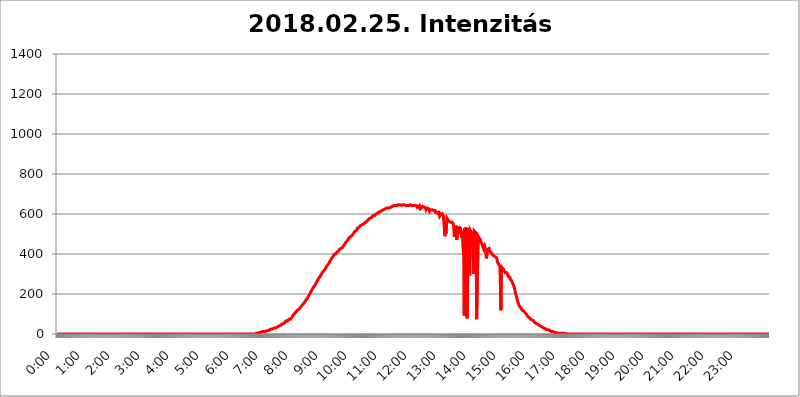
| Category | 2018.02.25. Intenzitás [W/m^2] |
|---|---|
| 0.0 | 0 |
| 0.0006944444444444445 | 0 |
| 0.001388888888888889 | 0 |
| 0.0020833333333333333 | 0 |
| 0.002777777777777778 | 0 |
| 0.003472222222222222 | 0 |
| 0.004166666666666667 | 0 |
| 0.004861111111111111 | 0 |
| 0.005555555555555556 | 0 |
| 0.0062499999999999995 | 0 |
| 0.006944444444444444 | 0 |
| 0.007638888888888889 | 0 |
| 0.008333333333333333 | 0 |
| 0.009027777777777779 | 0 |
| 0.009722222222222222 | 0 |
| 0.010416666666666666 | 0 |
| 0.011111111111111112 | 0 |
| 0.011805555555555555 | 0 |
| 0.012499999999999999 | 0 |
| 0.013194444444444444 | 0 |
| 0.013888888888888888 | 0 |
| 0.014583333333333332 | 0 |
| 0.015277777777777777 | 0 |
| 0.015972222222222224 | 0 |
| 0.016666666666666666 | 0 |
| 0.017361111111111112 | 0 |
| 0.018055555555555557 | 0 |
| 0.01875 | 0 |
| 0.019444444444444445 | 0 |
| 0.02013888888888889 | 0 |
| 0.020833333333333332 | 0 |
| 0.02152777777777778 | 0 |
| 0.022222222222222223 | 0 |
| 0.02291666666666667 | 0 |
| 0.02361111111111111 | 0 |
| 0.024305555555555556 | 0 |
| 0.024999999999999998 | 0 |
| 0.025694444444444447 | 0 |
| 0.02638888888888889 | 0 |
| 0.027083333333333334 | 0 |
| 0.027777777777777776 | 0 |
| 0.02847222222222222 | 0 |
| 0.029166666666666664 | 0 |
| 0.029861111111111113 | 0 |
| 0.030555555555555555 | 0 |
| 0.03125 | 0 |
| 0.03194444444444445 | 0 |
| 0.03263888888888889 | 0 |
| 0.03333333333333333 | 0 |
| 0.034027777777777775 | 0 |
| 0.034722222222222224 | 0 |
| 0.035416666666666666 | 0 |
| 0.036111111111111115 | 0 |
| 0.03680555555555556 | 0 |
| 0.0375 | 0 |
| 0.03819444444444444 | 0 |
| 0.03888888888888889 | 0 |
| 0.03958333333333333 | 0 |
| 0.04027777777777778 | 0 |
| 0.04097222222222222 | 0 |
| 0.041666666666666664 | 0 |
| 0.042361111111111106 | 0 |
| 0.04305555555555556 | 0 |
| 0.043750000000000004 | 0 |
| 0.044444444444444446 | 0 |
| 0.04513888888888889 | 0 |
| 0.04583333333333334 | 0 |
| 0.04652777777777778 | 0 |
| 0.04722222222222222 | 0 |
| 0.04791666666666666 | 0 |
| 0.04861111111111111 | 0 |
| 0.049305555555555554 | 0 |
| 0.049999999999999996 | 0 |
| 0.05069444444444445 | 0 |
| 0.051388888888888894 | 0 |
| 0.052083333333333336 | 0 |
| 0.05277777777777778 | 0 |
| 0.05347222222222222 | 0 |
| 0.05416666666666667 | 0 |
| 0.05486111111111111 | 0 |
| 0.05555555555555555 | 0 |
| 0.05625 | 0 |
| 0.05694444444444444 | 0 |
| 0.057638888888888885 | 0 |
| 0.05833333333333333 | 0 |
| 0.05902777777777778 | 0 |
| 0.059722222222222225 | 0 |
| 0.06041666666666667 | 0 |
| 0.061111111111111116 | 0 |
| 0.06180555555555556 | 0 |
| 0.0625 | 0 |
| 0.06319444444444444 | 0 |
| 0.06388888888888888 | 0 |
| 0.06458333333333334 | 0 |
| 0.06527777777777778 | 0 |
| 0.06597222222222222 | 0 |
| 0.06666666666666667 | 0 |
| 0.06736111111111111 | 0 |
| 0.06805555555555555 | 0 |
| 0.06874999999999999 | 0 |
| 0.06944444444444443 | 0 |
| 0.07013888888888889 | 0 |
| 0.07083333333333333 | 0 |
| 0.07152777777777779 | 0 |
| 0.07222222222222223 | 0 |
| 0.07291666666666667 | 0 |
| 0.07361111111111111 | 0 |
| 0.07430555555555556 | 0 |
| 0.075 | 0 |
| 0.07569444444444444 | 0 |
| 0.0763888888888889 | 0 |
| 0.07708333333333334 | 0 |
| 0.07777777777777778 | 0 |
| 0.07847222222222222 | 0 |
| 0.07916666666666666 | 0 |
| 0.0798611111111111 | 0 |
| 0.08055555555555556 | 0 |
| 0.08125 | 0 |
| 0.08194444444444444 | 0 |
| 0.08263888888888889 | 0 |
| 0.08333333333333333 | 0 |
| 0.08402777777777777 | 0 |
| 0.08472222222222221 | 0 |
| 0.08541666666666665 | 0 |
| 0.08611111111111112 | 0 |
| 0.08680555555555557 | 0 |
| 0.08750000000000001 | 0 |
| 0.08819444444444445 | 0 |
| 0.08888888888888889 | 0 |
| 0.08958333333333333 | 0 |
| 0.09027777777777778 | 0 |
| 0.09097222222222222 | 0 |
| 0.09166666666666667 | 0 |
| 0.09236111111111112 | 0 |
| 0.09305555555555556 | 0 |
| 0.09375 | 0 |
| 0.09444444444444444 | 0 |
| 0.09513888888888888 | 0 |
| 0.09583333333333333 | 0 |
| 0.09652777777777777 | 0 |
| 0.09722222222222222 | 0 |
| 0.09791666666666667 | 0 |
| 0.09861111111111111 | 0 |
| 0.09930555555555555 | 0 |
| 0.09999999999999999 | 0 |
| 0.10069444444444443 | 0 |
| 0.1013888888888889 | 0 |
| 0.10208333333333335 | 0 |
| 0.10277777777777779 | 0 |
| 0.10347222222222223 | 0 |
| 0.10416666666666667 | 0 |
| 0.10486111111111111 | 0 |
| 0.10555555555555556 | 0 |
| 0.10625 | 0 |
| 0.10694444444444444 | 0 |
| 0.1076388888888889 | 0 |
| 0.10833333333333334 | 0 |
| 0.10902777777777778 | 0 |
| 0.10972222222222222 | 0 |
| 0.1111111111111111 | 0 |
| 0.11180555555555556 | 0 |
| 0.11180555555555556 | 0 |
| 0.1125 | 0 |
| 0.11319444444444444 | 0 |
| 0.11388888888888889 | 0 |
| 0.11458333333333333 | 0 |
| 0.11527777777777777 | 0 |
| 0.11597222222222221 | 0 |
| 0.11666666666666665 | 0 |
| 0.1173611111111111 | 0 |
| 0.11805555555555557 | 0 |
| 0.11944444444444445 | 0 |
| 0.12013888888888889 | 0 |
| 0.12083333333333333 | 0 |
| 0.12152777777777778 | 0 |
| 0.12222222222222223 | 0 |
| 0.12291666666666667 | 0 |
| 0.12291666666666667 | 0 |
| 0.12361111111111112 | 0 |
| 0.12430555555555556 | 0 |
| 0.125 | 0 |
| 0.12569444444444444 | 0 |
| 0.12638888888888888 | 0 |
| 0.12708333333333333 | 0 |
| 0.16875 | 0 |
| 0.12847222222222224 | 0 |
| 0.12916666666666668 | 0 |
| 0.12986111111111112 | 0 |
| 0.13055555555555556 | 0 |
| 0.13125 | 0 |
| 0.13194444444444445 | 0 |
| 0.1326388888888889 | 0 |
| 0.13333333333333333 | 0 |
| 0.13402777777777777 | 0 |
| 0.13402777777777777 | 0 |
| 0.13472222222222222 | 0 |
| 0.13541666666666666 | 0 |
| 0.1361111111111111 | 0 |
| 0.13749999999999998 | 0 |
| 0.13819444444444443 | 0 |
| 0.1388888888888889 | 0 |
| 0.13958333333333334 | 0 |
| 0.14027777777777778 | 0 |
| 0.14097222222222222 | 0 |
| 0.14166666666666666 | 0 |
| 0.1423611111111111 | 0 |
| 0.14305555555555557 | 0 |
| 0.14375000000000002 | 0 |
| 0.14444444444444446 | 0 |
| 0.1451388888888889 | 0 |
| 0.1451388888888889 | 0 |
| 0.14652777777777778 | 0 |
| 0.14722222222222223 | 0 |
| 0.14791666666666667 | 0 |
| 0.1486111111111111 | 0 |
| 0.14930555555555555 | 0 |
| 0.15 | 0 |
| 0.15069444444444444 | 0 |
| 0.15138888888888888 | 0 |
| 0.15208333333333332 | 0 |
| 0.15277777777777776 | 0 |
| 0.15347222222222223 | 0 |
| 0.15416666666666667 | 0 |
| 0.15486111111111112 | 0 |
| 0.15555555555555556 | 0 |
| 0.15625 | 0 |
| 0.15694444444444444 | 0 |
| 0.15763888888888888 | 0 |
| 0.15833333333333333 | 0 |
| 0.15902777777777777 | 0 |
| 0.15972222222222224 | 0 |
| 0.16041666666666668 | 0 |
| 0.16111111111111112 | 0 |
| 0.16180555555555556 | 0 |
| 0.1625 | 0 |
| 0.16319444444444445 | 0 |
| 0.1638888888888889 | 0 |
| 0.16458333333333333 | 0 |
| 0.16527777777777777 | 0 |
| 0.16597222222222222 | 0 |
| 0.16666666666666666 | 0 |
| 0.1673611111111111 | 0 |
| 0.16805555555555554 | 0 |
| 0.16874999999999998 | 0 |
| 0.16944444444444443 | 0 |
| 0.17013888888888887 | 0 |
| 0.1708333333333333 | 0 |
| 0.17152777777777775 | 0 |
| 0.17222222222222225 | 0 |
| 0.1729166666666667 | 0 |
| 0.17361111111111113 | 0 |
| 0.17430555555555557 | 0 |
| 0.17500000000000002 | 0 |
| 0.17569444444444446 | 0 |
| 0.1763888888888889 | 0 |
| 0.17708333333333334 | 0 |
| 0.17777777777777778 | 0 |
| 0.17847222222222223 | 0 |
| 0.17916666666666667 | 0 |
| 0.1798611111111111 | 0 |
| 0.18055555555555555 | 0 |
| 0.18125 | 0 |
| 0.18194444444444444 | 0 |
| 0.1826388888888889 | 0 |
| 0.18333333333333335 | 0 |
| 0.1840277777777778 | 0 |
| 0.18472222222222223 | 0 |
| 0.18541666666666667 | 0 |
| 0.18611111111111112 | 0 |
| 0.18680555555555556 | 0 |
| 0.1875 | 0 |
| 0.18819444444444444 | 0 |
| 0.18888888888888888 | 0 |
| 0.18958333333333333 | 0 |
| 0.19027777777777777 | 0 |
| 0.1909722222222222 | 0 |
| 0.19166666666666665 | 0 |
| 0.19236111111111112 | 0 |
| 0.19305555555555554 | 0 |
| 0.19375 | 0 |
| 0.19444444444444445 | 0 |
| 0.1951388888888889 | 0 |
| 0.19583333333333333 | 0 |
| 0.19652777777777777 | 0 |
| 0.19722222222222222 | 0 |
| 0.19791666666666666 | 0 |
| 0.1986111111111111 | 0 |
| 0.19930555555555554 | 0 |
| 0.19999999999999998 | 0 |
| 0.20069444444444443 | 0 |
| 0.20138888888888887 | 0 |
| 0.2020833333333333 | 0 |
| 0.2027777777777778 | 0 |
| 0.2034722222222222 | 0 |
| 0.2041666666666667 | 0 |
| 0.20486111111111113 | 0 |
| 0.20555555555555557 | 0 |
| 0.20625000000000002 | 0 |
| 0.20694444444444446 | 0 |
| 0.2076388888888889 | 0 |
| 0.20833333333333334 | 0 |
| 0.20902777777777778 | 0 |
| 0.20972222222222223 | 0 |
| 0.21041666666666667 | 0 |
| 0.2111111111111111 | 0 |
| 0.21180555555555555 | 0 |
| 0.2125 | 0 |
| 0.21319444444444444 | 0 |
| 0.2138888888888889 | 0 |
| 0.21458333333333335 | 0 |
| 0.2152777777777778 | 0 |
| 0.21597222222222223 | 0 |
| 0.21666666666666667 | 0 |
| 0.21736111111111112 | 0 |
| 0.21805555555555556 | 0 |
| 0.21875 | 0 |
| 0.21944444444444444 | 0 |
| 0.22013888888888888 | 0 |
| 0.22083333333333333 | 0 |
| 0.22152777777777777 | 0 |
| 0.2222222222222222 | 0 |
| 0.22291666666666665 | 0 |
| 0.2236111111111111 | 0 |
| 0.22430555555555556 | 0 |
| 0.225 | 0 |
| 0.22569444444444445 | 0 |
| 0.2263888888888889 | 0 |
| 0.22708333333333333 | 0 |
| 0.22777777777777777 | 0 |
| 0.22847222222222222 | 0 |
| 0.22916666666666666 | 0 |
| 0.2298611111111111 | 0 |
| 0.23055555555555554 | 0 |
| 0.23124999999999998 | 0 |
| 0.23194444444444443 | 0 |
| 0.23263888888888887 | 0 |
| 0.2333333333333333 | 0 |
| 0.2340277777777778 | 0 |
| 0.2347222222222222 | 0 |
| 0.2354166666666667 | 0 |
| 0.23611111111111113 | 0 |
| 0.23680555555555557 | 0 |
| 0.23750000000000002 | 0 |
| 0.23819444444444446 | 0 |
| 0.2388888888888889 | 0 |
| 0.23958333333333334 | 0 |
| 0.24027777777777778 | 0 |
| 0.24097222222222223 | 0 |
| 0.24166666666666667 | 0 |
| 0.2423611111111111 | 0 |
| 0.24305555555555555 | 0 |
| 0.24375 | 0 |
| 0.24444444444444446 | 0 |
| 0.24513888888888888 | 0 |
| 0.24583333333333335 | 0 |
| 0.2465277777777778 | 0 |
| 0.24722222222222223 | 0 |
| 0.24791666666666667 | 0 |
| 0.24861111111111112 | 0 |
| 0.24930555555555556 | 0 |
| 0.25 | 0 |
| 0.25069444444444444 | 0 |
| 0.2513888888888889 | 0 |
| 0.2520833333333333 | 0 |
| 0.25277777777777777 | 0 |
| 0.2534722222222222 | 0 |
| 0.25416666666666665 | 0 |
| 0.2548611111111111 | 0 |
| 0.2555555555555556 | 0 |
| 0.25625000000000003 | 0 |
| 0.2569444444444445 | 0 |
| 0.2576388888888889 | 0 |
| 0.25833333333333336 | 0 |
| 0.2590277777777778 | 0 |
| 0.25972222222222224 | 0 |
| 0.2604166666666667 | 0 |
| 0.2611111111111111 | 0 |
| 0.26180555555555557 | 0 |
| 0.2625 | 0 |
| 0.26319444444444445 | 0 |
| 0.2638888888888889 | 0 |
| 0.26458333333333334 | 0 |
| 0.2652777777777778 | 0 |
| 0.2659722222222222 | 0 |
| 0.26666666666666666 | 0 |
| 0.2673611111111111 | 0 |
| 0.26805555555555555 | 0 |
| 0.26875 | 0 |
| 0.26944444444444443 | 0 |
| 0.2701388888888889 | 0 |
| 0.2708333333333333 | 0 |
| 0.27152777777777776 | 0 |
| 0.2722222222222222 | 0 |
| 0.27291666666666664 | 0 |
| 0.2736111111111111 | 0 |
| 0.2743055555555555 | 0 |
| 0.27499999999999997 | 0 |
| 0.27569444444444446 | 0 |
| 0.27638888888888885 | 0 |
| 0.27708333333333335 | 0 |
| 0.2777777777777778 | 3.525 |
| 0.27847222222222223 | 3.525 |
| 0.2791666666666667 | 3.525 |
| 0.2798611111111111 | 3.525 |
| 0.28055555555555556 | 3.525 |
| 0.28125 | 3.525 |
| 0.28194444444444444 | 7.887 |
| 0.2826388888888889 | 7.887 |
| 0.2833333333333333 | 7.887 |
| 0.28402777777777777 | 7.887 |
| 0.2847222222222222 | 12.257 |
| 0.28541666666666665 | 7.887 |
| 0.28611111111111115 | 12.257 |
| 0.28680555555555554 | 12.257 |
| 0.28750000000000003 | 12.257 |
| 0.2881944444444445 | 12.257 |
| 0.2888888888888889 | 12.257 |
| 0.28958333333333336 | 12.257 |
| 0.2902777777777778 | 12.257 |
| 0.29097222222222224 | 12.257 |
| 0.2916666666666667 | 12.257 |
| 0.2923611111111111 | 12.257 |
| 0.29305555555555557 | 16.636 |
| 0.29375 | 16.636 |
| 0.29444444444444445 | 16.636 |
| 0.2951388888888889 | 16.636 |
| 0.29583333333333334 | 16.636 |
| 0.2965277777777778 | 21.024 |
| 0.2972222222222222 | 21.024 |
| 0.29791666666666666 | 21.024 |
| 0.2986111111111111 | 21.024 |
| 0.29930555555555555 | 21.024 |
| 0.3 | 25.419 |
| 0.30069444444444443 | 25.419 |
| 0.3013888888888889 | 25.419 |
| 0.3020833333333333 | 25.419 |
| 0.30277777777777776 | 29.823 |
| 0.3034722222222222 | 25.419 |
| 0.30416666666666664 | 29.823 |
| 0.3048611111111111 | 29.823 |
| 0.3055555555555555 | 29.823 |
| 0.30624999999999997 | 29.823 |
| 0.3069444444444444 | 29.823 |
| 0.3076388888888889 | 34.234 |
| 0.30833333333333335 | 34.234 |
| 0.3090277777777778 | 38.653 |
| 0.30972222222222223 | 38.653 |
| 0.3104166666666667 | 38.653 |
| 0.3111111111111111 | 38.653 |
| 0.31180555555555556 | 43.079 |
| 0.3125 | 43.079 |
| 0.31319444444444444 | 47.511 |
| 0.3138888888888889 | 47.511 |
| 0.3145833333333333 | 47.511 |
| 0.31527777777777777 | 47.511 |
| 0.3159722222222222 | 51.951 |
| 0.31666666666666665 | 51.951 |
| 0.31736111111111115 | 56.398 |
| 0.31805555555555554 | 56.398 |
| 0.31875000000000003 | 56.398 |
| 0.3194444444444445 | 60.85 |
| 0.3201388888888889 | 60.85 |
| 0.32083333333333336 | 65.31 |
| 0.3215277777777778 | 65.31 |
| 0.32222222222222224 | 65.31 |
| 0.3229166666666667 | 65.31 |
| 0.3236111111111111 | 69.775 |
| 0.32430555555555557 | 69.775 |
| 0.325 | 74.246 |
| 0.32569444444444445 | 74.246 |
| 0.3263888888888889 | 74.246 |
| 0.32708333333333334 | 74.246 |
| 0.3277777777777778 | 78.722 |
| 0.3284722222222222 | 78.722 |
| 0.32916666666666666 | 83.205 |
| 0.3298611111111111 | 87.692 |
| 0.33055555555555555 | 92.184 |
| 0.33125 | 92.184 |
| 0.33194444444444443 | 96.682 |
| 0.3326388888888889 | 101.184 |
| 0.3333333333333333 | 101.184 |
| 0.3340277777777778 | 105.69 |
| 0.3347222222222222 | 110.201 |
| 0.3354166666666667 | 110.201 |
| 0.3361111111111111 | 114.716 |
| 0.3368055555555556 | 119.235 |
| 0.33749999999999997 | 119.235 |
| 0.33819444444444446 | 123.758 |
| 0.33888888888888885 | 123.758 |
| 0.33958333333333335 | 128.284 |
| 0.34027777777777773 | 128.284 |
| 0.34097222222222223 | 132.814 |
| 0.3416666666666666 | 137.347 |
| 0.3423611111111111 | 137.347 |
| 0.3430555555555555 | 141.884 |
| 0.34375 | 146.423 |
| 0.3444444444444445 | 146.423 |
| 0.3451388888888889 | 150.964 |
| 0.3458333333333334 | 155.509 |
| 0.34652777777777777 | 155.509 |
| 0.34722222222222227 | 160.056 |
| 0.34791666666666665 | 164.605 |
| 0.34861111111111115 | 169.156 |
| 0.34930555555555554 | 173.709 |
| 0.35000000000000003 | 173.709 |
| 0.3506944444444444 | 178.264 |
| 0.3513888888888889 | 182.82 |
| 0.3520833333333333 | 187.378 |
| 0.3527777777777778 | 191.937 |
| 0.3534722222222222 | 196.497 |
| 0.3541666666666667 | 201.058 |
| 0.3548611111111111 | 205.62 |
| 0.35555555555555557 | 210.182 |
| 0.35625 | 214.746 |
| 0.35694444444444445 | 219.309 |
| 0.3576388888888889 | 223.873 |
| 0.35833333333333334 | 228.436 |
| 0.3590277777777778 | 233 |
| 0.3597222222222222 | 233 |
| 0.36041666666666666 | 237.564 |
| 0.3611111111111111 | 242.127 |
| 0.36180555555555555 | 246.689 |
| 0.3625 | 251.251 |
| 0.36319444444444443 | 255.813 |
| 0.3638888888888889 | 260.373 |
| 0.3645833333333333 | 264.932 |
| 0.3652777777777778 | 269.49 |
| 0.3659722222222222 | 274.047 |
| 0.3666666666666667 | 278.603 |
| 0.3673611111111111 | 283.156 |
| 0.3680555555555556 | 283.156 |
| 0.36874999999999997 | 287.709 |
| 0.36944444444444446 | 292.259 |
| 0.37013888888888885 | 296.808 |
| 0.37083333333333335 | 301.354 |
| 0.37152777777777773 | 305.898 |
| 0.37222222222222223 | 305.898 |
| 0.3729166666666666 | 310.44 |
| 0.3736111111111111 | 314.98 |
| 0.3743055555555555 | 319.517 |
| 0.375 | 319.517 |
| 0.3756944444444445 | 324.052 |
| 0.3763888888888889 | 328.584 |
| 0.3770833333333334 | 333.113 |
| 0.37777777777777777 | 337.639 |
| 0.37847222222222227 | 342.162 |
| 0.37916666666666665 | 342.162 |
| 0.37986111111111115 | 346.682 |
| 0.38055555555555554 | 351.198 |
| 0.38125000000000003 | 355.712 |
| 0.3819444444444444 | 360.221 |
| 0.3826388888888889 | 364.728 |
| 0.3833333333333333 | 369.23 |
| 0.3840277777777778 | 373.729 |
| 0.3847222222222222 | 378.224 |
| 0.3854166666666667 | 378.224 |
| 0.3861111111111111 | 382.715 |
| 0.38680555555555557 | 387.202 |
| 0.3875 | 391.685 |
| 0.38819444444444445 | 396.164 |
| 0.3888888888888889 | 396.164 |
| 0.38958333333333334 | 400.638 |
| 0.3902777777777778 | 400.638 |
| 0.3909722222222222 | 405.108 |
| 0.39166666666666666 | 405.108 |
| 0.3923611111111111 | 409.574 |
| 0.39305555555555555 | 414.035 |
| 0.39375 | 414.035 |
| 0.39444444444444443 | 414.035 |
| 0.3951388888888889 | 418.492 |
| 0.3958333333333333 | 422.943 |
| 0.3965277777777778 | 422.943 |
| 0.3972222222222222 | 422.943 |
| 0.3979166666666667 | 427.39 |
| 0.3986111111111111 | 431.833 |
| 0.3993055555555556 | 431.833 |
| 0.39999999999999997 | 431.833 |
| 0.40069444444444446 | 436.27 |
| 0.40138888888888885 | 440.702 |
| 0.40208333333333335 | 445.129 |
| 0.40277777777777773 | 445.129 |
| 0.40347222222222223 | 449.551 |
| 0.4041666666666666 | 453.968 |
| 0.4048611111111111 | 458.38 |
| 0.4055555555555555 | 458.38 |
| 0.40625 | 462.786 |
| 0.4069444444444445 | 467.187 |
| 0.4076388888888889 | 471.582 |
| 0.4083333333333334 | 475.972 |
| 0.40902777777777777 | 475.972 |
| 0.40972222222222227 | 480.356 |
| 0.41041666666666665 | 484.735 |
| 0.41111111111111115 | 484.735 |
| 0.41180555555555554 | 489.108 |
| 0.41250000000000003 | 489.108 |
| 0.4131944444444444 | 493.475 |
| 0.4138888888888889 | 493.475 |
| 0.4145833333333333 | 497.836 |
| 0.4152777777777778 | 502.192 |
| 0.4159722222222222 | 506.542 |
| 0.4166666666666667 | 506.542 |
| 0.4173611111111111 | 510.885 |
| 0.41805555555555557 | 515.223 |
| 0.41875 | 515.223 |
| 0.41944444444444445 | 519.555 |
| 0.4201388888888889 | 519.555 |
| 0.42083333333333334 | 528.2 |
| 0.4215277777777778 | 528.2 |
| 0.4222222222222222 | 532.513 |
| 0.42291666666666666 | 532.513 |
| 0.4236111111111111 | 536.82 |
| 0.42430555555555555 | 536.82 |
| 0.425 | 541.121 |
| 0.42569444444444443 | 541.121 |
| 0.4263888888888889 | 541.121 |
| 0.4270833333333333 | 545.416 |
| 0.4277777777777778 | 545.416 |
| 0.4284722222222222 | 549.704 |
| 0.4291666666666667 | 549.704 |
| 0.4298611111111111 | 553.986 |
| 0.4305555555555556 | 553.986 |
| 0.43124999999999997 | 553.986 |
| 0.43194444444444446 | 558.261 |
| 0.43263888888888885 | 558.261 |
| 0.43333333333333335 | 562.53 |
| 0.43402777777777773 | 566.793 |
| 0.43472222222222223 | 562.53 |
| 0.4354166666666666 | 566.793 |
| 0.4361111111111111 | 571.049 |
| 0.4368055555555555 | 575.299 |
| 0.4375 | 575.299 |
| 0.4381944444444445 | 571.049 |
| 0.4388888888888889 | 579.542 |
| 0.4395833333333334 | 583.779 |
| 0.44027777777777777 | 583.779 |
| 0.44097222222222227 | 583.779 |
| 0.44166666666666665 | 588.009 |
| 0.44236111111111115 | 588.009 |
| 0.44305555555555554 | 592.233 |
| 0.44375000000000003 | 592.233 |
| 0.4444444444444444 | 588.009 |
| 0.4451388888888889 | 592.233 |
| 0.4458333333333333 | 596.45 |
| 0.4465277777777778 | 596.45 |
| 0.4472222222222222 | 600.661 |
| 0.4479166666666667 | 600.661 |
| 0.4486111111111111 | 604.864 |
| 0.44930555555555557 | 604.864 |
| 0.45 | 609.062 |
| 0.45069444444444445 | 609.062 |
| 0.4513888888888889 | 609.062 |
| 0.45208333333333334 | 609.062 |
| 0.4527777777777778 | 609.062 |
| 0.4534722222222222 | 613.252 |
| 0.45416666666666666 | 617.436 |
| 0.4548611111111111 | 617.436 |
| 0.45555555555555555 | 617.436 |
| 0.45625 | 617.436 |
| 0.45694444444444443 | 621.613 |
| 0.4576388888888889 | 621.613 |
| 0.4583333333333333 | 625.784 |
| 0.4590277777777778 | 625.784 |
| 0.4597222222222222 | 625.784 |
| 0.4604166666666667 | 625.784 |
| 0.4611111111111111 | 625.784 |
| 0.4618055555555556 | 629.948 |
| 0.46249999999999997 | 629.948 |
| 0.46319444444444446 | 625.784 |
| 0.46388888888888885 | 629.948 |
| 0.46458333333333335 | 625.784 |
| 0.46527777777777773 | 625.784 |
| 0.46597222222222223 | 629.948 |
| 0.4666666666666666 | 634.105 |
| 0.4673611111111111 | 634.105 |
| 0.4680555555555555 | 634.105 |
| 0.46875 | 638.256 |
| 0.4694444444444445 | 638.256 |
| 0.4701388888888889 | 638.256 |
| 0.4708333333333334 | 642.4 |
| 0.47152777777777777 | 642.4 |
| 0.47222222222222227 | 642.4 |
| 0.47291666666666665 | 642.4 |
| 0.47361111111111115 | 646.537 |
| 0.47430555555555554 | 642.4 |
| 0.47500000000000003 | 642.4 |
| 0.4756944444444444 | 642.4 |
| 0.4763888888888889 | 642.4 |
| 0.4770833333333333 | 642.4 |
| 0.4777777777777778 | 646.537 |
| 0.4784722222222222 | 646.537 |
| 0.4791666666666667 | 646.537 |
| 0.4798611111111111 | 646.537 |
| 0.48055555555555557 | 646.537 |
| 0.48125 | 642.4 |
| 0.48194444444444445 | 642.4 |
| 0.4826388888888889 | 642.4 |
| 0.48333333333333334 | 642.4 |
| 0.4840277777777778 | 646.537 |
| 0.4847222222222222 | 646.537 |
| 0.48541666666666666 | 650.667 |
| 0.4861111111111111 | 650.667 |
| 0.48680555555555555 | 646.537 |
| 0.4875 | 642.4 |
| 0.48819444444444443 | 642.4 |
| 0.4888888888888889 | 642.4 |
| 0.4895833333333333 | 642.4 |
| 0.4902777777777778 | 642.4 |
| 0.4909722222222222 | 642.4 |
| 0.4916666666666667 | 646.537 |
| 0.4923611111111111 | 642.4 |
| 0.4930555555555556 | 642.4 |
| 0.49374999999999997 | 642.4 |
| 0.49444444444444446 | 646.537 |
| 0.49513888888888885 | 646.537 |
| 0.49583333333333335 | 642.4 |
| 0.49652777777777773 | 642.4 |
| 0.49722222222222223 | 642.4 |
| 0.4979166666666666 | 642.4 |
| 0.4986111111111111 | 642.4 |
| 0.4993055555555555 | 642.4 |
| 0.5 | 642.4 |
| 0.5006944444444444 | 642.4 |
| 0.5013888888888889 | 642.4 |
| 0.5020833333333333 | 642.4 |
| 0.5027777777777778 | 642.4 |
| 0.5034722222222222 | 642.4 |
| 0.5041666666666667 | 638.256 |
| 0.5048611111111111 | 634.105 |
| 0.5055555555555555 | 634.105 |
| 0.50625 | 638.256 |
| 0.5069444444444444 | 638.256 |
| 0.5076388888888889 | 634.105 |
| 0.5083333333333333 | 629.948 |
| 0.5090277777777777 | 638.256 |
| 0.5097222222222222 | 634.105 |
| 0.5104166666666666 | 629.948 |
| 0.5111111111111112 | 625.784 |
| 0.5118055555555555 | 634.105 |
| 0.5125000000000001 | 638.256 |
| 0.5131944444444444 | 634.105 |
| 0.513888888888889 | 634.105 |
| 0.5145833333333333 | 634.105 |
| 0.5152777777777778 | 634.105 |
| 0.5159722222222222 | 634.105 |
| 0.5166666666666667 | 629.948 |
| 0.517361111111111 | 621.613 |
| 0.5180555555555556 | 621.613 |
| 0.5187499999999999 | 629.948 |
| 0.5194444444444445 | 625.784 |
| 0.5201388888888888 | 625.784 |
| 0.5208333333333334 | 625.784 |
| 0.5215277777777778 | 621.613 |
| 0.5222222222222223 | 613.252 |
| 0.5229166666666667 | 617.436 |
| 0.5236111111111111 | 621.613 |
| 0.5243055555555556 | 621.613 |
| 0.525 | 621.613 |
| 0.5256944444444445 | 621.613 |
| 0.5263888888888889 | 617.436 |
| 0.5270833333333333 | 617.436 |
| 0.5277777777777778 | 617.436 |
| 0.5284722222222222 | 613.252 |
| 0.5291666666666667 | 613.252 |
| 0.5298611111111111 | 617.436 |
| 0.5305555555555556 | 609.062 |
| 0.53125 | 609.062 |
| 0.5319444444444444 | 609.062 |
| 0.5326388888888889 | 604.864 |
| 0.5333333333333333 | 604.864 |
| 0.5340277777777778 | 609.062 |
| 0.5347222222222222 | 609.062 |
| 0.5354166666666667 | 600.661 |
| 0.5361111111111111 | 609.062 |
| 0.5368055555555555 | 592.233 |
| 0.5375 | 592.233 |
| 0.5381944444444444 | 600.661 |
| 0.5388888888888889 | 600.661 |
| 0.5395833333333333 | 600.661 |
| 0.5402777777777777 | 600.661 |
| 0.5409722222222222 | 596.45 |
| 0.5416666666666666 | 588.009 |
| 0.5423611111111112 | 592.233 |
| 0.5430555555555555 | 588.009 |
| 0.5437500000000001 | 489.108 |
| 0.5444444444444444 | 541.121 |
| 0.545138888888889 | 502.192 |
| 0.5458333333333333 | 549.704 |
| 0.5465277777777778 | 579.542 |
| 0.5472222222222222 | 579.542 |
| 0.5479166666666667 | 571.049 |
| 0.548611111111111 | 571.049 |
| 0.5493055555555556 | 566.793 |
| 0.5499999999999999 | 562.53 |
| 0.5506944444444445 | 562.53 |
| 0.5513888888888888 | 558.261 |
| 0.5520833333333334 | 558.261 |
| 0.5527777777777778 | 562.53 |
| 0.5534722222222223 | 558.261 |
| 0.5541666666666667 | 558.261 |
| 0.5548611111111111 | 553.986 |
| 0.5555555555555556 | 549.704 |
| 0.55625 | 528.2 |
| 0.5569444444444445 | 484.735 |
| 0.5576388888888889 | 515.223 |
| 0.5583333333333333 | 541.121 |
| 0.5590277777777778 | 532.513 |
| 0.5597222222222222 | 541.121 |
| 0.5604166666666667 | 471.582 |
| 0.5611111111111111 | 532.513 |
| 0.5618055555555556 | 515.223 |
| 0.5625 | 532.513 |
| 0.5631944444444444 | 502.192 |
| 0.5638888888888889 | 536.82 |
| 0.5645833333333333 | 515.223 |
| 0.5652777777777778 | 532.513 |
| 0.5659722222222222 | 532.513 |
| 0.5666666666666667 | 532.513 |
| 0.5673611111111111 | 480.356 |
| 0.5680555555555555 | 480.356 |
| 0.56875 | 515.223 |
| 0.5694444444444444 | 422.943 |
| 0.5701388888888889 | 382.715 |
| 0.5708333333333333 | 92.184 |
| 0.5715277777777777 | 528.2 |
| 0.5722222222222222 | 445.129 |
| 0.5729166666666666 | 532.513 |
| 0.5736111111111112 | 519.555 |
| 0.5743055555555555 | 87.692 |
| 0.5750000000000001 | 78.722 |
| 0.5756944444444444 | 74.246 |
| 0.576388888888889 | 528.2 |
| 0.5770833333333333 | 515.223 |
| 0.5777777777777778 | 506.542 |
| 0.5784722222222222 | 292.259 |
| 0.5791666666666667 | 519.555 |
| 0.579861111111111 | 519.555 |
| 0.5805555555555556 | 510.885 |
| 0.5812499999999999 | 510.885 |
| 0.5819444444444445 | 510.885 |
| 0.5826388888888888 | 484.735 |
| 0.5833333333333334 | 422.943 |
| 0.5840277777777778 | 301.354 |
| 0.5847222222222223 | 515.223 |
| 0.5854166666666667 | 515.223 |
| 0.5861111111111111 | 515.223 |
| 0.5868055555555556 | 506.542 |
| 0.5875 | 480.356 |
| 0.5881944444444445 | 74.246 |
| 0.5888888888888889 | 74.246 |
| 0.5895833333333333 | 78.722 |
| 0.5902777777777778 | 489.108 |
| 0.5909722222222222 | 484.735 |
| 0.5916666666666667 | 480.356 |
| 0.5923611111111111 | 480.356 |
| 0.5930555555555556 | 475.972 |
| 0.59375 | 471.582 |
| 0.5944444444444444 | 458.38 |
| 0.5951388888888889 | 453.968 |
| 0.5958333333333333 | 449.551 |
| 0.5965277777777778 | 440.702 |
| 0.5972222222222222 | 445.129 |
| 0.5979166666666667 | 427.39 |
| 0.5986111111111111 | 431.833 |
| 0.5993055555555555 | 440.702 |
| 0.6 | 431.833 |
| 0.6006944444444444 | 427.39 |
| 0.6013888888888889 | 431.833 |
| 0.6020833333333333 | 378.224 |
| 0.6027777777777777 | 400.638 |
| 0.6034722222222222 | 422.943 |
| 0.6041666666666666 | 422.943 |
| 0.6048611111111112 | 422.943 |
| 0.6055555555555555 | 427.39 |
| 0.6062500000000001 | 418.492 |
| 0.6069444444444444 | 414.035 |
| 0.607638888888889 | 409.574 |
| 0.6083333333333333 | 405.108 |
| 0.6090277777777778 | 405.108 |
| 0.6097222222222222 | 400.638 |
| 0.6104166666666667 | 396.164 |
| 0.611111111111111 | 396.164 |
| 0.6118055555555556 | 391.685 |
| 0.6124999999999999 | 387.202 |
| 0.6131944444444445 | 387.202 |
| 0.6138888888888888 | 387.202 |
| 0.6145833333333334 | 387.202 |
| 0.6152777777777778 | 387.202 |
| 0.6159722222222223 | 382.715 |
| 0.6166666666666667 | 373.729 |
| 0.6173611111111111 | 360.221 |
| 0.6180555555555556 | 355.712 |
| 0.61875 | 351.198 |
| 0.6194444444444445 | 351.198 |
| 0.6201388888888889 | 351.198 |
| 0.6208333333333333 | 337.639 |
| 0.6215277777777778 | 251.251 |
| 0.6222222222222222 | 119.235 |
| 0.6229166666666667 | 314.98 |
| 0.6236111111111111 | 333.113 |
| 0.6243055555555556 | 333.113 |
| 0.625 | 333.113 |
| 0.6256944444444444 | 324.052 |
| 0.6263888888888889 | 324.052 |
| 0.6270833333333333 | 314.98 |
| 0.6277777777777778 | 310.44 |
| 0.6284722222222222 | 305.898 |
| 0.6291666666666667 | 310.44 |
| 0.6298611111111111 | 310.44 |
| 0.6305555555555555 | 305.898 |
| 0.63125 | 301.354 |
| 0.6319444444444444 | 296.808 |
| 0.6326388888888889 | 287.709 |
| 0.6333333333333333 | 283.156 |
| 0.6340277777777777 | 287.709 |
| 0.6347222222222222 | 283.156 |
| 0.6354166666666666 | 274.047 |
| 0.6361111111111112 | 269.49 |
| 0.6368055555555555 | 269.49 |
| 0.6375000000000001 | 264.932 |
| 0.6381944444444444 | 260.373 |
| 0.638888888888889 | 251.251 |
| 0.6395833333333333 | 246.689 |
| 0.6402777777777778 | 242.127 |
| 0.6409722222222222 | 233 |
| 0.6416666666666667 | 223.873 |
| 0.642361111111111 | 210.182 |
| 0.6430555555555556 | 201.058 |
| 0.6437499999999999 | 191.937 |
| 0.6444444444444445 | 182.82 |
| 0.6451388888888888 | 169.156 |
| 0.6458333333333334 | 164.605 |
| 0.6465277777777778 | 155.509 |
| 0.6472222222222223 | 146.423 |
| 0.6479166666666667 | 141.884 |
| 0.6486111111111111 | 137.347 |
| 0.6493055555555556 | 132.814 |
| 0.65 | 132.814 |
| 0.6506944444444445 | 128.284 |
| 0.6513888888888889 | 123.758 |
| 0.6520833333333333 | 119.235 |
| 0.6527777777777778 | 119.235 |
| 0.6534722222222222 | 114.716 |
| 0.6541666666666667 | 114.716 |
| 0.6548611111111111 | 110.201 |
| 0.6555555555555556 | 110.201 |
| 0.65625 | 105.69 |
| 0.6569444444444444 | 101.184 |
| 0.6576388888888889 | 101.184 |
| 0.6583333333333333 | 96.682 |
| 0.6590277777777778 | 92.184 |
| 0.6597222222222222 | 87.692 |
| 0.6604166666666667 | 87.692 |
| 0.6611111111111111 | 83.205 |
| 0.6618055555555555 | 83.205 |
| 0.6625 | 78.722 |
| 0.6631944444444444 | 78.722 |
| 0.6638888888888889 | 74.246 |
| 0.6645833333333333 | 74.246 |
| 0.6652777777777777 | 69.775 |
| 0.6659722222222222 | 69.775 |
| 0.6666666666666666 | 65.31 |
| 0.6673611111111111 | 65.31 |
| 0.6680555555555556 | 65.31 |
| 0.6687500000000001 | 60.85 |
| 0.6694444444444444 | 60.85 |
| 0.6701388888888888 | 56.398 |
| 0.6708333333333334 | 56.398 |
| 0.6715277777777778 | 56.398 |
| 0.6722222222222222 | 51.951 |
| 0.6729166666666666 | 51.951 |
| 0.6736111111111112 | 47.511 |
| 0.6743055555555556 | 47.511 |
| 0.6749999999999999 | 47.511 |
| 0.6756944444444444 | 43.079 |
| 0.6763888888888889 | 43.079 |
| 0.6770833333333334 | 38.653 |
| 0.6777777777777777 | 38.653 |
| 0.6784722222222223 | 38.653 |
| 0.6791666666666667 | 38.653 |
| 0.6798611111111111 | 34.234 |
| 0.6805555555555555 | 34.234 |
| 0.68125 | 29.823 |
| 0.6819444444444445 | 29.823 |
| 0.6826388888888889 | 29.823 |
| 0.6833333333333332 | 29.823 |
| 0.6840277777777778 | 29.823 |
| 0.6847222222222222 | 25.419 |
| 0.6854166666666667 | 25.419 |
| 0.686111111111111 | 25.419 |
| 0.6868055555555556 | 21.024 |
| 0.6875 | 21.024 |
| 0.6881944444444444 | 21.024 |
| 0.688888888888889 | 21.024 |
| 0.6895833333333333 | 21.024 |
| 0.6902777777777778 | 21.024 |
| 0.6909722222222222 | 16.636 |
| 0.6916666666666668 | 16.636 |
| 0.6923611111111111 | 16.636 |
| 0.6930555555555555 | 12.257 |
| 0.69375 | 12.257 |
| 0.6944444444444445 | 12.257 |
| 0.6951388888888889 | 12.257 |
| 0.6958333333333333 | 7.887 |
| 0.6965277777777777 | 7.887 |
| 0.6972222222222223 | 7.887 |
| 0.6979166666666666 | 7.887 |
| 0.6986111111111111 | 7.887 |
| 0.6993055555555556 | 7.887 |
| 0.7000000000000001 | 7.887 |
| 0.7006944444444444 | 3.525 |
| 0.7013888888888888 | 3.525 |
| 0.7020833333333334 | 3.525 |
| 0.7027777777777778 | 3.525 |
| 0.7034722222222222 | 3.525 |
| 0.7041666666666666 | 3.525 |
| 0.7048611111111112 | 3.525 |
| 0.7055555555555556 | 3.525 |
| 0.7062499999999999 | 3.525 |
| 0.7069444444444444 | 3.525 |
| 0.7076388888888889 | 3.525 |
| 0.7083333333333334 | 3.525 |
| 0.7090277777777777 | 3.525 |
| 0.7097222222222223 | 3.525 |
| 0.7104166666666667 | 0 |
| 0.7111111111111111 | 3.525 |
| 0.7118055555555555 | 3.525 |
| 0.7125 | 0 |
| 0.7131944444444445 | 0 |
| 0.7138888888888889 | 0 |
| 0.7145833333333332 | 0 |
| 0.7152777777777778 | 0 |
| 0.7159722222222222 | 0 |
| 0.7166666666666667 | 0 |
| 0.717361111111111 | 0 |
| 0.7180555555555556 | 0 |
| 0.71875 | 0 |
| 0.7194444444444444 | 0 |
| 0.720138888888889 | 0 |
| 0.7208333333333333 | 0 |
| 0.7215277777777778 | 0 |
| 0.7222222222222222 | 0 |
| 0.7229166666666668 | 0 |
| 0.7236111111111111 | 0 |
| 0.7243055555555555 | 0 |
| 0.725 | 0 |
| 0.7256944444444445 | 0 |
| 0.7263888888888889 | 0 |
| 0.7270833333333333 | 0 |
| 0.7277777777777777 | 0 |
| 0.7284722222222223 | 0 |
| 0.7291666666666666 | 0 |
| 0.7298611111111111 | 0 |
| 0.7305555555555556 | 0 |
| 0.7312500000000001 | 0 |
| 0.7319444444444444 | 0 |
| 0.7326388888888888 | 0 |
| 0.7333333333333334 | 0 |
| 0.7340277777777778 | 0 |
| 0.7347222222222222 | 0 |
| 0.7354166666666666 | 0 |
| 0.7361111111111112 | 0 |
| 0.7368055555555556 | 0 |
| 0.7374999999999999 | 0 |
| 0.7381944444444444 | 0 |
| 0.7388888888888889 | 0 |
| 0.7395833333333334 | 0 |
| 0.7402777777777777 | 0 |
| 0.7409722222222223 | 0 |
| 0.7416666666666667 | 0 |
| 0.7423611111111111 | 0 |
| 0.7430555555555555 | 0 |
| 0.74375 | 0 |
| 0.7444444444444445 | 0 |
| 0.7451388888888889 | 0 |
| 0.7458333333333332 | 0 |
| 0.7465277777777778 | 0 |
| 0.7472222222222222 | 0 |
| 0.7479166666666667 | 0 |
| 0.748611111111111 | 0 |
| 0.7493055555555556 | 0 |
| 0.75 | 0 |
| 0.7506944444444444 | 0 |
| 0.751388888888889 | 0 |
| 0.7520833333333333 | 0 |
| 0.7527777777777778 | 0 |
| 0.7534722222222222 | 0 |
| 0.7541666666666668 | 0 |
| 0.7548611111111111 | 0 |
| 0.7555555555555555 | 0 |
| 0.75625 | 0 |
| 0.7569444444444445 | 0 |
| 0.7576388888888889 | 0 |
| 0.7583333333333333 | 0 |
| 0.7590277777777777 | 0 |
| 0.7597222222222223 | 0 |
| 0.7604166666666666 | 0 |
| 0.7611111111111111 | 0 |
| 0.7618055555555556 | 0 |
| 0.7625000000000001 | 0 |
| 0.7631944444444444 | 0 |
| 0.7638888888888888 | 0 |
| 0.7645833333333334 | 0 |
| 0.7652777777777778 | 0 |
| 0.7659722222222222 | 0 |
| 0.7666666666666666 | 0 |
| 0.7673611111111112 | 0 |
| 0.7680555555555556 | 0 |
| 0.7687499999999999 | 0 |
| 0.7694444444444444 | 0 |
| 0.7701388888888889 | 0 |
| 0.7708333333333334 | 0 |
| 0.7715277777777777 | 0 |
| 0.7722222222222223 | 0 |
| 0.7729166666666667 | 0 |
| 0.7736111111111111 | 0 |
| 0.7743055555555555 | 0 |
| 0.775 | 0 |
| 0.7756944444444445 | 0 |
| 0.7763888888888889 | 0 |
| 0.7770833333333332 | 0 |
| 0.7777777777777778 | 0 |
| 0.7784722222222222 | 0 |
| 0.7791666666666667 | 0 |
| 0.779861111111111 | 0 |
| 0.7805555555555556 | 0 |
| 0.78125 | 0 |
| 0.7819444444444444 | 0 |
| 0.782638888888889 | 0 |
| 0.7833333333333333 | 0 |
| 0.7840277777777778 | 0 |
| 0.7847222222222222 | 0 |
| 0.7854166666666668 | 0 |
| 0.7861111111111111 | 0 |
| 0.7868055555555555 | 0 |
| 0.7875 | 0 |
| 0.7881944444444445 | 0 |
| 0.7888888888888889 | 0 |
| 0.7895833333333333 | 0 |
| 0.7902777777777777 | 0 |
| 0.7909722222222223 | 0 |
| 0.7916666666666666 | 0 |
| 0.7923611111111111 | 0 |
| 0.7930555555555556 | 0 |
| 0.7937500000000001 | 0 |
| 0.7944444444444444 | 0 |
| 0.7951388888888888 | 0 |
| 0.7958333333333334 | 0 |
| 0.7965277777777778 | 0 |
| 0.7972222222222222 | 0 |
| 0.7979166666666666 | 0 |
| 0.7986111111111112 | 0 |
| 0.7993055555555556 | 0 |
| 0.7999999999999999 | 0 |
| 0.8006944444444444 | 0 |
| 0.8013888888888889 | 0 |
| 0.8020833333333334 | 0 |
| 0.8027777777777777 | 0 |
| 0.8034722222222223 | 0 |
| 0.8041666666666667 | 0 |
| 0.8048611111111111 | 0 |
| 0.8055555555555555 | 0 |
| 0.80625 | 0 |
| 0.8069444444444445 | 0 |
| 0.8076388888888889 | 0 |
| 0.8083333333333332 | 0 |
| 0.8090277777777778 | 0 |
| 0.8097222222222222 | 0 |
| 0.8104166666666667 | 0 |
| 0.811111111111111 | 0 |
| 0.8118055555555556 | 0 |
| 0.8125 | 0 |
| 0.8131944444444444 | 0 |
| 0.813888888888889 | 0 |
| 0.8145833333333333 | 0 |
| 0.8152777777777778 | 0 |
| 0.8159722222222222 | 0 |
| 0.8166666666666668 | 0 |
| 0.8173611111111111 | 0 |
| 0.8180555555555555 | 0 |
| 0.81875 | 0 |
| 0.8194444444444445 | 0 |
| 0.8201388888888889 | 0 |
| 0.8208333333333333 | 0 |
| 0.8215277777777777 | 0 |
| 0.8222222222222223 | 0 |
| 0.8229166666666666 | 0 |
| 0.8236111111111111 | 0 |
| 0.8243055555555556 | 0 |
| 0.8250000000000001 | 0 |
| 0.8256944444444444 | 0 |
| 0.8263888888888888 | 0 |
| 0.8270833333333334 | 0 |
| 0.8277777777777778 | 0 |
| 0.8284722222222222 | 0 |
| 0.8291666666666666 | 0 |
| 0.8298611111111112 | 0 |
| 0.8305555555555556 | 0 |
| 0.8312499999999999 | 0 |
| 0.8319444444444444 | 0 |
| 0.8326388888888889 | 0 |
| 0.8333333333333334 | 0 |
| 0.8340277777777777 | 0 |
| 0.8347222222222223 | 0 |
| 0.8354166666666667 | 0 |
| 0.8361111111111111 | 0 |
| 0.8368055555555555 | 0 |
| 0.8375 | 0 |
| 0.8381944444444445 | 0 |
| 0.8388888888888889 | 0 |
| 0.8395833333333332 | 0 |
| 0.8402777777777778 | 0 |
| 0.8409722222222222 | 0 |
| 0.8416666666666667 | 0 |
| 0.842361111111111 | 0 |
| 0.8430555555555556 | 0 |
| 0.84375 | 0 |
| 0.8444444444444444 | 0 |
| 0.845138888888889 | 0 |
| 0.8458333333333333 | 0 |
| 0.8465277777777778 | 0 |
| 0.8472222222222222 | 0 |
| 0.8479166666666668 | 0 |
| 0.8486111111111111 | 0 |
| 0.8493055555555555 | 0 |
| 0.85 | 0 |
| 0.8506944444444445 | 0 |
| 0.8513888888888889 | 0 |
| 0.8520833333333333 | 0 |
| 0.8527777777777777 | 0 |
| 0.8534722222222223 | 0 |
| 0.8541666666666666 | 0 |
| 0.8548611111111111 | 0 |
| 0.8555555555555556 | 0 |
| 0.8562500000000001 | 0 |
| 0.8569444444444444 | 0 |
| 0.8576388888888888 | 0 |
| 0.8583333333333334 | 0 |
| 0.8590277777777778 | 0 |
| 0.8597222222222222 | 0 |
| 0.8604166666666666 | 0 |
| 0.8611111111111112 | 0 |
| 0.8618055555555556 | 0 |
| 0.8624999999999999 | 0 |
| 0.8631944444444444 | 0 |
| 0.8638888888888889 | 0 |
| 0.8645833333333334 | 0 |
| 0.8652777777777777 | 0 |
| 0.8659722222222223 | 0 |
| 0.8666666666666667 | 0 |
| 0.8673611111111111 | 0 |
| 0.8680555555555555 | 0 |
| 0.86875 | 0 |
| 0.8694444444444445 | 0 |
| 0.8701388888888889 | 0 |
| 0.8708333333333332 | 0 |
| 0.8715277777777778 | 0 |
| 0.8722222222222222 | 0 |
| 0.8729166666666667 | 0 |
| 0.873611111111111 | 0 |
| 0.8743055555555556 | 0 |
| 0.875 | 0 |
| 0.8756944444444444 | 0 |
| 0.876388888888889 | 0 |
| 0.8770833333333333 | 0 |
| 0.8777777777777778 | 0 |
| 0.8784722222222222 | 0 |
| 0.8791666666666668 | 0 |
| 0.8798611111111111 | 0 |
| 0.8805555555555555 | 0 |
| 0.88125 | 0 |
| 0.8819444444444445 | 0 |
| 0.8826388888888889 | 0 |
| 0.8833333333333333 | 0 |
| 0.8840277777777777 | 0 |
| 0.8847222222222223 | 0 |
| 0.8854166666666666 | 0 |
| 0.8861111111111111 | 0 |
| 0.8868055555555556 | 0 |
| 0.8875000000000001 | 0 |
| 0.8881944444444444 | 0 |
| 0.8888888888888888 | 0 |
| 0.8895833333333334 | 0 |
| 0.8902777777777778 | 0 |
| 0.8909722222222222 | 0 |
| 0.8916666666666666 | 0 |
| 0.8923611111111112 | 0 |
| 0.8930555555555556 | 0 |
| 0.8937499999999999 | 0 |
| 0.8944444444444444 | 0 |
| 0.8951388888888889 | 0 |
| 0.8958333333333334 | 0 |
| 0.8965277777777777 | 0 |
| 0.8972222222222223 | 0 |
| 0.8979166666666667 | 0 |
| 0.8986111111111111 | 0 |
| 0.8993055555555555 | 0 |
| 0.9 | 0 |
| 0.9006944444444445 | 0 |
| 0.9013888888888889 | 0 |
| 0.9020833333333332 | 0 |
| 0.9027777777777778 | 0 |
| 0.9034722222222222 | 0 |
| 0.9041666666666667 | 0 |
| 0.904861111111111 | 0 |
| 0.9055555555555556 | 0 |
| 0.90625 | 0 |
| 0.9069444444444444 | 0 |
| 0.907638888888889 | 0 |
| 0.9083333333333333 | 0 |
| 0.9090277777777778 | 0 |
| 0.9097222222222222 | 0 |
| 0.9104166666666668 | 0 |
| 0.9111111111111111 | 0 |
| 0.9118055555555555 | 0 |
| 0.9125 | 0 |
| 0.9131944444444445 | 0 |
| 0.9138888888888889 | 0 |
| 0.9145833333333333 | 0 |
| 0.9152777777777777 | 0 |
| 0.9159722222222223 | 0 |
| 0.9166666666666666 | 0 |
| 0.9173611111111111 | 0 |
| 0.9180555555555556 | 0 |
| 0.9187500000000001 | 0 |
| 0.9194444444444444 | 0 |
| 0.9201388888888888 | 0 |
| 0.9208333333333334 | 0 |
| 0.9215277777777778 | 0 |
| 0.9222222222222222 | 0 |
| 0.9229166666666666 | 0 |
| 0.9236111111111112 | 0 |
| 0.9243055555555556 | 0 |
| 0.9249999999999999 | 0 |
| 0.9256944444444444 | 0 |
| 0.9263888888888889 | 0 |
| 0.9270833333333334 | 0 |
| 0.9277777777777777 | 0 |
| 0.9284722222222223 | 0 |
| 0.9291666666666667 | 0 |
| 0.9298611111111111 | 0 |
| 0.9305555555555555 | 0 |
| 0.93125 | 0 |
| 0.9319444444444445 | 0 |
| 0.9326388888888889 | 0 |
| 0.9333333333333332 | 0 |
| 0.9340277777777778 | 0 |
| 0.9347222222222222 | 0 |
| 0.9354166666666667 | 0 |
| 0.936111111111111 | 0 |
| 0.9368055555555556 | 0 |
| 0.9375 | 0 |
| 0.9381944444444444 | 0 |
| 0.938888888888889 | 0 |
| 0.9395833333333333 | 0 |
| 0.9402777777777778 | 0 |
| 0.9409722222222222 | 0 |
| 0.9416666666666668 | 0 |
| 0.9423611111111111 | 0 |
| 0.9430555555555555 | 0 |
| 0.94375 | 0 |
| 0.9444444444444445 | 0 |
| 0.9451388888888889 | 0 |
| 0.9458333333333333 | 0 |
| 0.9465277777777777 | 0 |
| 0.9472222222222223 | 0 |
| 0.9479166666666666 | 0 |
| 0.9486111111111111 | 0 |
| 0.9493055555555556 | 0 |
| 0.9500000000000001 | 0 |
| 0.9506944444444444 | 0 |
| 0.9513888888888888 | 0 |
| 0.9520833333333334 | 0 |
| 0.9527777777777778 | 0 |
| 0.9534722222222222 | 0 |
| 0.9541666666666666 | 0 |
| 0.9548611111111112 | 0 |
| 0.9555555555555556 | 0 |
| 0.9562499999999999 | 0 |
| 0.9569444444444444 | 0 |
| 0.9576388888888889 | 0 |
| 0.9583333333333334 | 0 |
| 0.9590277777777777 | 0 |
| 0.9597222222222223 | 0 |
| 0.9604166666666667 | 0 |
| 0.9611111111111111 | 0 |
| 0.9618055555555555 | 0 |
| 0.9625 | 0 |
| 0.9631944444444445 | 0 |
| 0.9638888888888889 | 0 |
| 0.9645833333333332 | 0 |
| 0.9652777777777778 | 0 |
| 0.9659722222222222 | 0 |
| 0.9666666666666667 | 0 |
| 0.967361111111111 | 0 |
| 0.9680555555555556 | 0 |
| 0.96875 | 0 |
| 0.9694444444444444 | 0 |
| 0.970138888888889 | 0 |
| 0.9708333333333333 | 0 |
| 0.9715277777777778 | 0 |
| 0.9722222222222222 | 0 |
| 0.9729166666666668 | 0 |
| 0.9736111111111111 | 0 |
| 0.9743055555555555 | 0 |
| 0.975 | 0 |
| 0.9756944444444445 | 0 |
| 0.9763888888888889 | 0 |
| 0.9770833333333333 | 0 |
| 0.9777777777777777 | 0 |
| 0.9784722222222223 | 0 |
| 0.9791666666666666 | 0 |
| 0.9798611111111111 | 0 |
| 0.9805555555555556 | 0 |
| 0.9812500000000001 | 0 |
| 0.9819444444444444 | 0 |
| 0.9826388888888888 | 0 |
| 0.9833333333333334 | 0 |
| 0.9840277777777778 | 0 |
| 0.9847222222222222 | 0 |
| 0.9854166666666666 | 0 |
| 0.9861111111111112 | 0 |
| 0.9868055555555556 | 0 |
| 0.9874999999999999 | 0 |
| 0.9881944444444444 | 0 |
| 0.9888888888888889 | 0 |
| 0.9895833333333334 | 0 |
| 0.9902777777777777 | 0 |
| 0.9909722222222223 | 0 |
| 0.9916666666666667 | 0 |
| 0.9923611111111111 | 0 |
| 0.9930555555555555 | 0 |
| 0.99375 | 0 |
| 0.9944444444444445 | 0 |
| 0.9951388888888889 | 0 |
| 0.9958333333333332 | 0 |
| 0.9965277777777778 | 0 |
| 0.9972222222222222 | 0 |
| 0.9979166666666667 | 0 |
| 0.998611111111111 | 0 |
| 0.9993055555555556 | 0 |